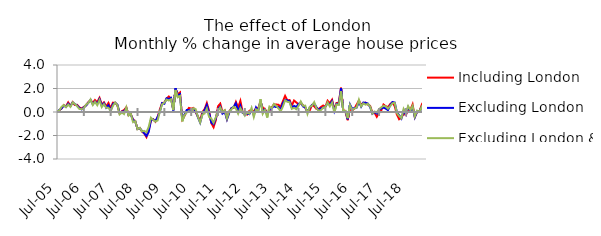
| Category | Including London | Excluding London | Excluding London & SE |
|---|---|---|---|
| 2005-07-01 | 0.005 | -0.018 | 0.075 |
| 2005-08-01 | 0.13 | 0.166 | 0.116 |
| 2005-09-01 | 0.301 | 0.301 | 0.427 |
| 2005-10-01 | 0.587 | 0.545 | 0.588 |
| 2005-11-01 | 0.481 | 0.432 | 0.405 |
| 2005-12-01 | 0.815 | 0.707 | 0.633 |
| 2006-01-01 | 0.512 | 0.507 | 0.437 |
| 2006-02-01 | 0.839 | 0.811 | 0.823 |
| 2006-03-01 | 0.59 | 0.672 | 0.678 |
| 2006-04-01 | 0.61 | 0.551 | 0.495 |
| 2006-05-01 | 0.39 | 0.354 | 0.259 |
| 2006-06-01 | 0.294 | 0.228 | 0.235 |
| 2006-07-01 | 0.43 | 0.396 | 0.326 |
| 2006-08-01 | 0.57 | 0.555 | 0.632 |
| 2006-09-01 | 0.838 | 0.793 | 0.768 |
| 2006-10-01 | 0.993 | 1.026 | 1.075 |
| 2006-11-01 | 0.782 | 0.654 | 0.595 |
| 2006-12-01 | 1.025 | 0.889 | 0.869 |
| 2007-01-01 | 0.837 | 0.672 | 0.578 |
| 2007-02-01 | 1.203 | 1.096 | 1.007 |
| 2007-03-01 | 0.635 | 0.55 | 0.414 |
| 2007-04-01 | 0.824 | 0.747 | 0.672 |
| 2007-05-01 | 0.476 | 0.36 | 0.364 |
| 2007-06-01 | 0.769 | 0.561 | 0.37 |
| 2007-07-01 | 0.305 | 0.103 | 0.071 |
| 2007-08-01 | 0.796 | 0.678 | 0.53 |
| 2007-09-01 | 0.787 | 0.789 | 0.799 |
| 2007-10-01 | 0.58 | 0.618 | 0.582 |
| 2007-11-01 | -0.112 | -0.08 | -0.203 |
| 2007-12-01 | 0.065 | 0.033 | -0.042 |
| 2008-01-01 | 0.173 | 0.053 | -0.176 |
| 2008-02-01 | 0.401 | 0.319 | 0.395 |
| 2008-03-01 | -0.272 | -0.253 | -0.301 |
| 2008-04-01 | -0.195 | -0.208 | -0.153 |
| 2008-05-01 | -0.647 | -0.674 | -0.863 |
| 2008-06-01 | -0.781 | -0.806 | -0.772 |
| 2008-07-01 | -1.442 | -1.448 | -1.464 |
| 2008-08-01 | -1.364 | -1.38 | -1.349 |
| 2008-09-01 | -1.669 | -1.605 | -1.651 |
| 2008-10-01 | -1.821 | -1.81 | -1.611 |
| 2008-11-01 | -2.138 | -2.042 | -1.717 |
| 2008-12-01 | -1.553 | -1.692 | -1.275 |
| 2009-01-01 | -0.731 | -0.692 | -0.481 |
| 2009-02-01 | -0.621 | -0.635 | -0.67 |
| 2009-03-01 | -0.825 | -0.776 | -0.813 |
| 2009-04-01 | -0.427 | -0.431 | -0.716 |
| 2009-05-01 | 0.213 | 0.024 | 0.043 |
| 2009-06-01 | 0.764 | 0.762 | 0.658 |
| 2009-07-01 | 0.798 | 0.703 | 0.801 |
| 2009-08-01 | 1.133 | 1.169 | 1.06 |
| 2009-09-01 | 1.32 | 1.11 | 0.974 |
| 2009-10-01 | 1.163 | 1.205 | 1.086 |
| 2009-11-01 | 0.201 | 0.122 | 0.163 |
| 2009-12-01 | 1.966 | 2.017 | 1.88 |
| 2010-01-01 | 1.507 | 1.365 | 1.254 |
| 2010-02-01 | 1.665 | 1.511 | 1.363 |
| 2010-03-01 | -0.631 | -0.695 | -0.795 |
| 2010-04-01 | -0.333 | -0.243 | -0.277 |
| 2010-05-01 | 0.073 | 0.169 | -0.045 |
| 2010-06-01 | 0.35 | 0.155 | 0.077 |
| 2010-07-01 | 0.284 | 0.116 | -0.038 |
| 2010-08-01 | 0.345 | 0.271 | 0.321 |
| 2010-09-01 | -0.014 | 0.1 | 0.244 |
| 2010-10-01 | -0.392 | -0.437 | -0.408 |
| 2010-11-01 | -0.732 | -0.897 | -0.894 |
| 2010-12-01 | -0.005 | -0.187 | -0.227 |
| 2011-01-01 | 0.24 | 0.151 | -0.122 |
| 2011-02-01 | 0.761 | 0.589 | 0.297 |
| 2011-03-01 | 0.093 | -0.058 | -0.421 |
| 2011-04-01 | -0.951 | -0.897 | -0.565 |
| 2011-05-01 | -1.297 | -1.037 | -0.913 |
| 2011-06-01 | -0.711 | -0.565 | -0.454 |
| 2011-07-01 | 0.487 | 0.241 | 0.1 |
| 2011-08-01 | 0.71 | 0.47 | 0.396 |
| 2011-09-01 | -0.012 | -0.134 | -0.007 |
| 2011-10-01 | 0.126 | 0.028 | 0.154 |
| 2011-11-01 | -0.566 | -0.631 | -0.547 |
| 2011-12-01 | 0.032 | -0.072 | 0.068 |
| 2012-01-01 | 0.323 | 0.321 | 0.219 |
| 2012-02-01 | 0.352 | 0.448 | 0.449 |
| 2012-03-01 | 0.849 | 0.734 | 0.291 |
| 2012-04-01 | 0.375 | 0.058 | -0.146 |
| 2012-05-01 | 0.938 | 0.532 | 0.329 |
| 2012-06-01 | 0.004 | -0.075 | 0.008 |
| 2012-07-01 | -0.1 | -0.164 | -0.316 |
| 2012-08-01 | -0.217 | -0.144 | -0.047 |
| 2012-09-01 | 0.1 | -0.188 | -0.14 |
| 2012-10-01 | 0.185 | 0.178 | 0.349 |
| 2012-11-01 | 0.047 | -0.257 | -0.422 |
| 2012-12-01 | 0.311 | 0.391 | 0.227 |
| 2013-01-01 | 0.331 | 0.109 | 0.093 |
| 2013-02-01 | 0.856 | 0.945 | 1.091 |
| 2013-03-01 | 0.368 | 0.077 | -0.147 |
| 2013-04-01 | 0.266 | 0.191 | 0.173 |
| 2013-05-01 | -0.109 | -0.235 | -0.474 |
| 2013-06-01 | 0.137 | 0.18 | 0.456 |
| 2013-07-01 | 0.377 | 0.345 | 0.307 |
| 2013-08-01 | 0.653 | 0.485 | 0.685 |
| 2013-09-01 | 0.637 | 0.416 | 0.531 |
| 2013-10-01 | 0.618 | 0.426 | 0.312 |
| 2013-11-01 | 0.442 | 0.18 | 0.062 |
| 2013-12-01 | 0.903 | 0.753 | 0.458 |
| 2014-01-01 | 1.372 | 1.029 | 0.994 |
| 2014-02-01 | 0.988 | 0.994 | 0.868 |
| 2014-03-01 | 1.017 | 0.908 | 0.825 |
| 2014-04-01 | 0.553 | 0.367 | 0.264 |
| 2014-05-01 | 0.975 | 0.516 | 0.355 |
| 2014-06-01 | 0.817 | 0.418 | 0.237 |
| 2014-07-01 | 0.649 | 0.686 | 0.517 |
| 2014-08-01 | 0.748 | 0.818 | 0.892 |
| 2014-09-01 | 0.573 | 0.475 | 0.538 |
| 2014-10-01 | 0.364 | 0.4 | 0.542 |
| 2014-11-01 | 0.006 | -0.01 | -0.155 |
| 2014-12-01 | 0.136 | 0.384 | 0.434 |
| 2015-01-01 | 0.576 | 0.597 | 0.529 |
| 2015-02-01 | 0.494 | 0.708 | 0.838 |
| 2015-03-01 | 0.259 | 0.415 | 0.319 |
| 2015-04-01 | 0.24 | 0.138 | 0.098 |
| 2015-05-01 | 0.421 | 0.317 | 0.166 |
| 2015-06-01 | 0.552 | 0.356 | 0.363 |
| 2015-07-01 | 0.44 | 0.456 | 0.417 |
| 2015-08-01 | 0.958 | 0.744 | 0.817 |
| 2015-09-01 | 0.755 | 0.646 | 0.477 |
| 2015-10-01 | 1.043 | 0.918 | 0.806 |
| 2015-11-01 | 0.212 | 0.1 | -0.04 |
| 2015-12-01 | 0.764 | 0.702 | 0.648 |
| 2016-01-01 | 0.798 | 0.671 | 0.602 |
| 2016-02-01 | 2.067 | 2.031 | 1.772 |
| 2016-03-01 | 0.169 | 0.06 | 0.064 |
| 2016-04-01 | -0.006 | 0.058 | 0.096 |
| 2016-05-01 | -0.698 | -0.616 | -0.528 |
| 2016-06-01 | 0.334 | 0.647 | 0.592 |
| 2016-07-01 | 0.14 | 0.27 | 0.149 |
| 2016-08-01 | 0.289 | 0.339 | 0.298 |
| 2016-09-01 | 0.636 | 0.378 | 0.395 |
| 2016-10-01 | 0.968 | 0.862 | 1.043 |
| 2016-11-01 | 0.632 | 0.452 | 0.476 |
| 2016-12-01 | 0.743 | 0.804 | 0.729 |
| 2017-01-01 | 0.799 | 0.782 | 0.623 |
| 2017-02-01 | 0.633 | 0.717 | 0.692 |
| 2017-03-01 | 0.532 | 0.428 | 0.479 |
| 2017-04-01 | -0.041 | -0.153 | -0.134 |
| 2017-05-01 | -0.065 | -0.011 | 0.036 |
| 2017-06-01 | -0.409 | -0.136 | -0.043 |
| 2017-07-01 | -0.073 | 0.178 | 0.242 |
| 2017-08-01 | 0.136 | 0.307 | 0.397 |
| 2017-09-01 | 0.638 | 0.372 | 0.529 |
| 2017-10-01 | 0.488 | 0.29 | 0.49 |
| 2017-11-01 | 0.417 | 0.156 | 0.287 |
| 2017-12-01 | 0.673 | 0.586 | 0.51 |
| 2018-01-01 | 0.825 | 0.848 | 0.745 |
| 2018-02-01 | 0.505 | 0.804 | 0.777 |
| 2018-03-01 | -0.23 | -0.028 | -0.099 |
| 2018-04-01 | -0.614 | -0.277 | -0.34 |
| 2018-05-01 | -0.477 | -0.552 | -0.529 |
| 2018-06-01 | -0.144 | 0.115 | 0.267 |
| 2018-07-01 | -0.267 | -0.211 | -0.072 |
| 2018-08-01 | 0.239 | 0.408 | 0.501 |
| 2018-09-01 | 0.177 | 0.098 | 0.15 |
| 2018-10-01 | 0.64 | 0.414 | 0.522 |
| 2018-11-01 | -0.426 | -0.445 | -0.384 |
| 2018-12-01 | 0.005 | 0.03 | 0.117 |
| 2019-01-01 | 0.012 | 0.06 | 0.019 |
| 2019-02-01 | 0.558 | 0.395 | 0.402 |
| 2019-03-01 | -0.024 | -0.123 | -0.142 |
| 2019-04-01 | -0.06 | -0.128 | -0.11 |